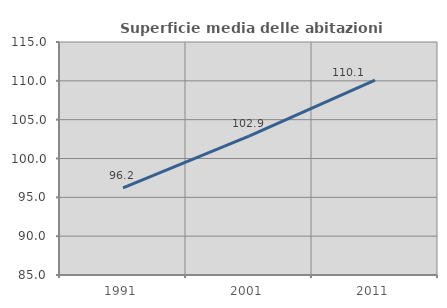
| Category | Superficie media delle abitazioni occupate |
|---|---|
| 1991.0 | 96.225 |
| 2001.0 | 102.874 |
| 2011.0 | 110.106 |